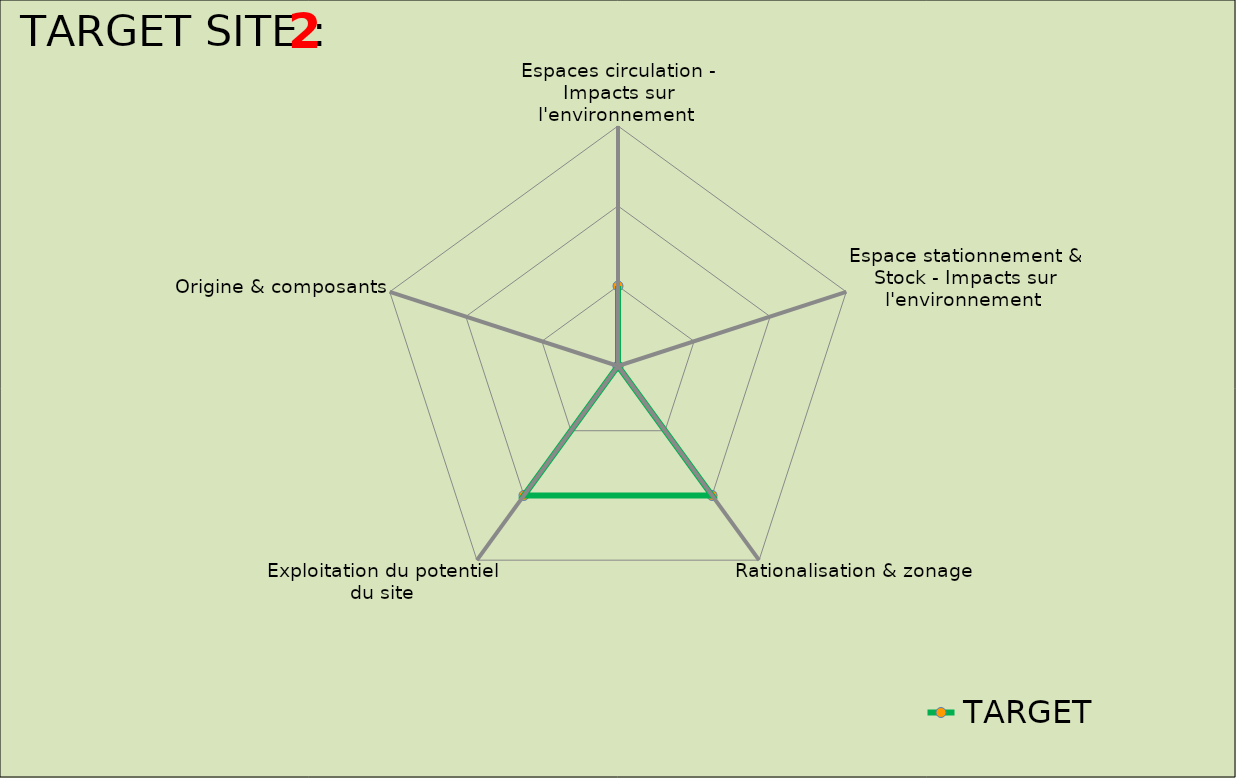
| Category | TARGET |
|---|---|
| Espaces circulation - Impacts sur l'environnement  | 1 |
| Espace stationnement & Stock - Impacts sur l'environnement  | 0 |
| Rationalisation & zonage | 2 |
| Exploitation du potentiel du site | 2 |
| Origine & composants | 0 |